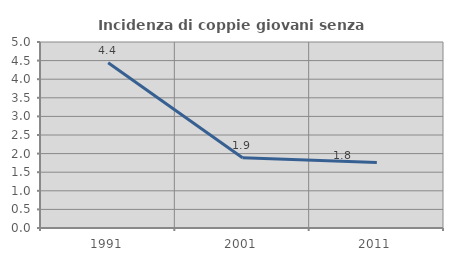
| Category | Incidenza di coppie giovani senza figli |
|---|---|
| 1991.0 | 4.444 |
| 2001.0 | 1.89 |
| 2011.0 | 1.758 |